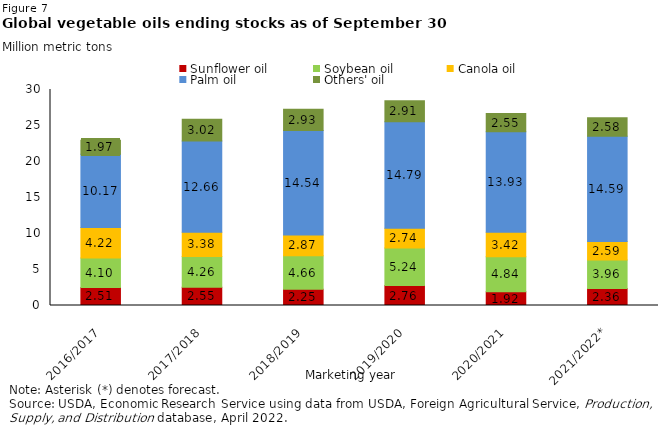
| Category | Sunflower oil | Soybean oil  | Canola oil  | Palm oil  | Others' oil |
|---|---|---|---|---|---|
| 2016/2017 | 2.511 | 4.095 | 4.217 | 10.167 | 1.97 |
| 2017/2018 | 2.549 | 4.26 | 3.377 | 12.663 | 3.017 |
| 2018/2019 | 2.248 | 4.664 | 2.866 | 14.537 | 2.926 |
| 2019/2020 | 2.761 | 5.238 | 2.738 | 14.788 | 2.905 |
| 2020/2021 | 1.919 | 4.842 | 3.422 | 13.933 | 2.552 |
| 2021/2022* | 2.359 | 3.955 | 2.587 | 14.591 | 2.575 |